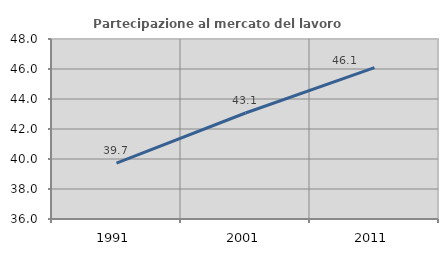
| Category | Partecipazione al mercato del lavoro  femminile |
|---|---|
| 1991.0 | 39.73 |
| 2001.0 | 43.067 |
| 2011.0 | 46.088 |